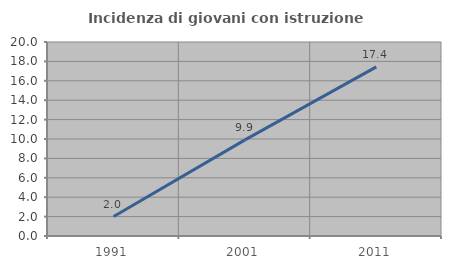
| Category | Incidenza di giovani con istruzione universitaria |
|---|---|
| 1991.0 | 2.01 |
| 2001.0 | 9.906 |
| 2011.0 | 17.436 |